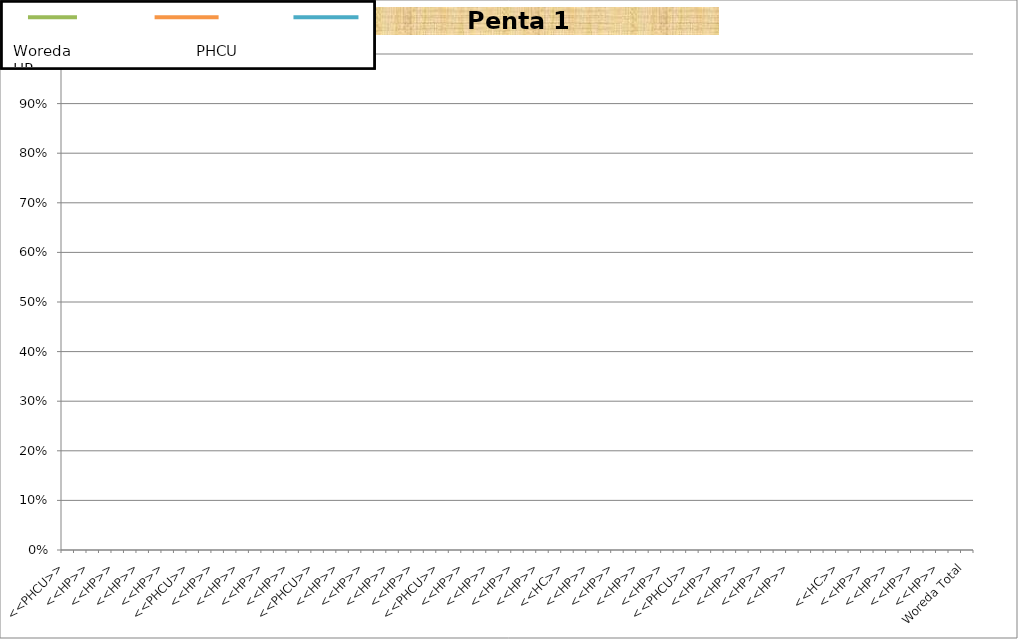
| Category | Penta 1 |
|---|---|
| <<PHCU>> | 0 |
| <<HC>> | 0 |
| <<HP>> | 0 |
| <<HP>> | 0 |
| <<HP>> | 0 |
| <<HP>> | 0 |
| <<HP>> | 0 |
| <<HP>> | 0 |
| <<HP>> | 0 |
|  | 0 |
| <<PHCU>> | 0 |
| <<HC>> | 0 |
| <<HP>> | 0 |
| <<HP>> | 0 |
| <<HP>> | 0 |
| <<HP>> | 0 |
| <<HP>> | 0 |
| <<HP>> | 0 |
| <<HP>> | 0 |
|  | 0 |
| <<PHCU>> | 0 |
| <<HC>> | 0 |
| <<HP>> | 0 |
| <<HP>> | 0 |
| <<HP>> | 0 |
| <<HP>> | 0 |
| <<HP>> | 0 |
| <<HP>> | 0 |
| <<HP>> | 0 |
|  | 0 |
| <<PHCU>> | 0 |
| <<HC>> | 0 |
| <<HP>> | 0 |
| <<HP>> | 0 |
| <<HP>> | 0 |
| <<HP>> | 0 |
| <<HP>> | 0 |
| <<HP>> | 0 |
| <<HP>> | 0 |
|  | 0 |
| <<HC>> | 0 |
| <<HP>> | 0 |
| <<HP>> | 0 |
| <<HP>> | 0 |
| <<HP>> | 0 |
| <<HP>> | 0 |
| <<HP>> | 0 |
| <<HP>> | 0 |
| <<HP>> | 0 |
|  | 0 |
| <<PHCU>> | 0 |
| <<HC>> | 0 |
| <<HP>> | 0 |
| <<HP>> | 0 |
| <<HP>> | 0 |
| <<HP>> | 0 |
| <<HP>> | 0 |
| <<HP>> | 0 |
| <<HP>> | 0 |
| <<HP>> | 0 |
|  | 0 |
| <<PHCU>> | 0 |
| <<HC>> | 0 |
| <<HP>> | 0 |
| <<HP>> | 0 |
| <<HP>> | 0 |
| <<HP>> | 0 |
| <<HP>> | 0 |
| <<HP>> | 0 |
| <<HP>> | 0 |
| <<HP>> | 0 |
|  | 0 |
| Woreda Total | 0 |